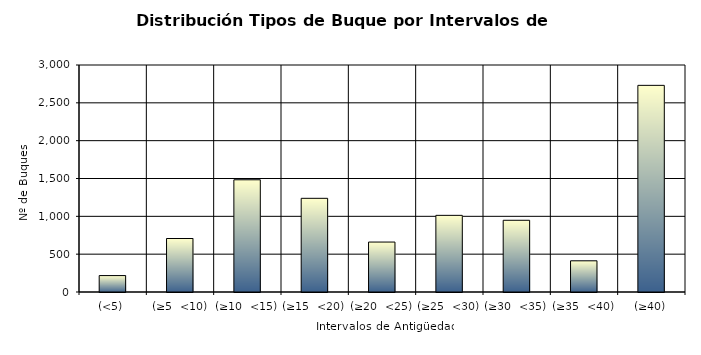
| Category | Series 0 |
|---|---|
| (<5) | 217 |
| (≥5  <10) | 707 |
| (≥10  <15) | 1483 |
| (≥15  <20) | 1238 |
| (≥20  <25) | 660 |
| (≥25  <30) | 1013 |
| (≥30  <35) | 948 |
| (≥35  <40) | 412 |
| (≥40) | 2731 |